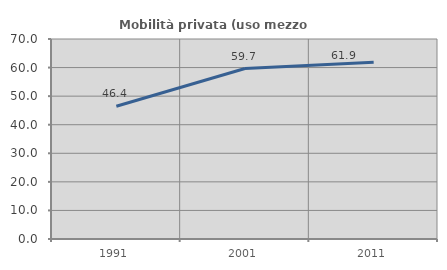
| Category | Mobilità privata (uso mezzo privato) |
|---|---|
| 1991.0 | 46.444 |
| 2001.0 | 59.665 |
| 2011.0 | 61.899 |